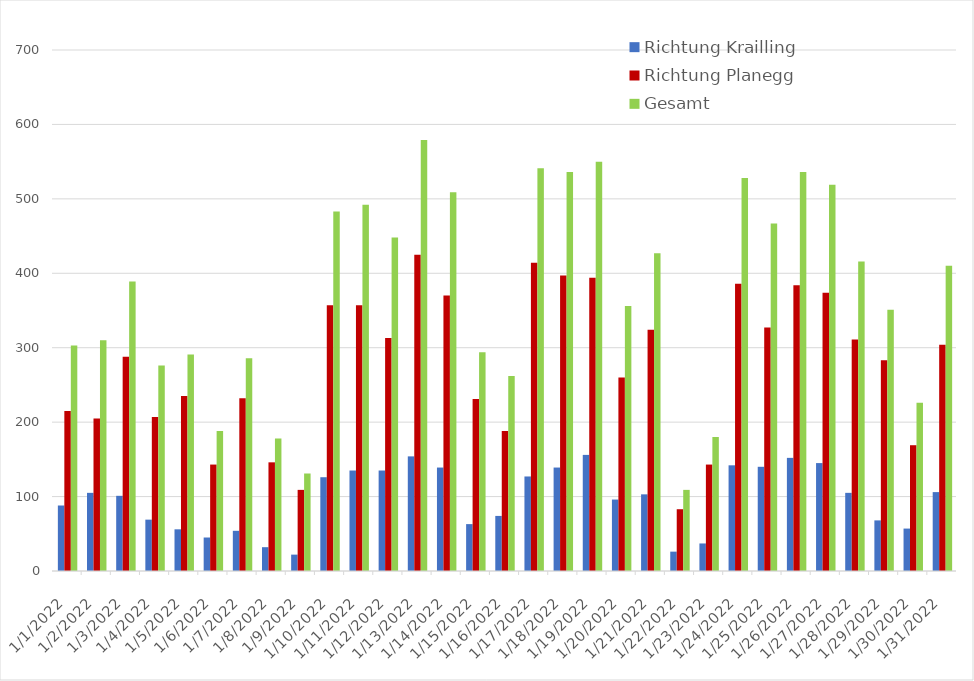
| Category | Richtung Krailling | Richtung Planegg | Gesamt |
|---|---|---|---|
| 1/1/22 | 88 | 215 | 303 |
| 1/2/22 | 105 | 205 | 310 |
| 1/3/22 | 101 | 288 | 389 |
| 1/4/22 | 69 | 207 | 276 |
| 1/5/22 | 56 | 235 | 291 |
| 1/6/22 | 45 | 143 | 188 |
| 1/7/22 | 54 | 232 | 286 |
| 1/8/22 | 32 | 146 | 178 |
| 1/9/22 | 22 | 109 | 131 |
| 1/10/22 | 126 | 357 | 483 |
| 1/11/22 | 135 | 357 | 492 |
| 1/12/22 | 135 | 313 | 448 |
| 1/13/22 | 154 | 425 | 579 |
| 1/14/22 | 139 | 370 | 509 |
| 1/15/22 | 63 | 231 | 294 |
| 1/16/22 | 74 | 188 | 262 |
| 1/17/22 | 127 | 414 | 541 |
| 1/18/22 | 139 | 397 | 536 |
| 1/19/22 | 156 | 394 | 550 |
| 1/20/22 | 96 | 260 | 356 |
| 1/21/22 | 103 | 324 | 427 |
| 1/22/22 | 26 | 83 | 109 |
| 1/23/22 | 37 | 143 | 180 |
| 1/24/22 | 142 | 386 | 528 |
| 1/25/22 | 140 | 327 | 467 |
| 1/26/22 | 152 | 384 | 536 |
| 1/27/22 | 145 | 374 | 519 |
| 1/28/22 | 105 | 311 | 416 |
| 1/29/22 | 68 | 283 | 351 |
| 1/30/22 | 57 | 169 | 226 |
| 1/31/22 | 106 | 304 | 410 |